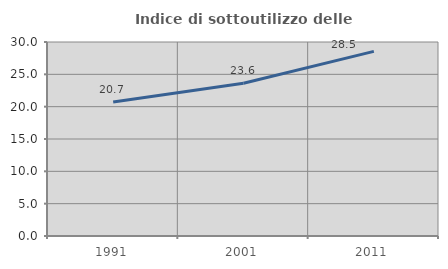
| Category | Indice di sottoutilizzo delle abitazioni  |
|---|---|
| 1991.0 | 20.723 |
| 2001.0 | 23.617 |
| 2011.0 | 28.546 |